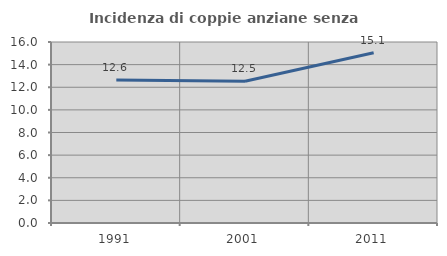
| Category | Incidenza di coppie anziane senza figli  |
|---|---|
| 1991.0 | 12.649 |
| 2001.0 | 12.527 |
| 2011.0 | 15.054 |